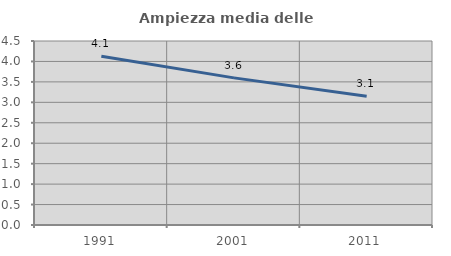
| Category | Ampiezza media delle famiglie |
|---|---|
| 1991.0 | 4.126 |
| 2001.0 | 3.598 |
| 2011.0 | 3.149 |